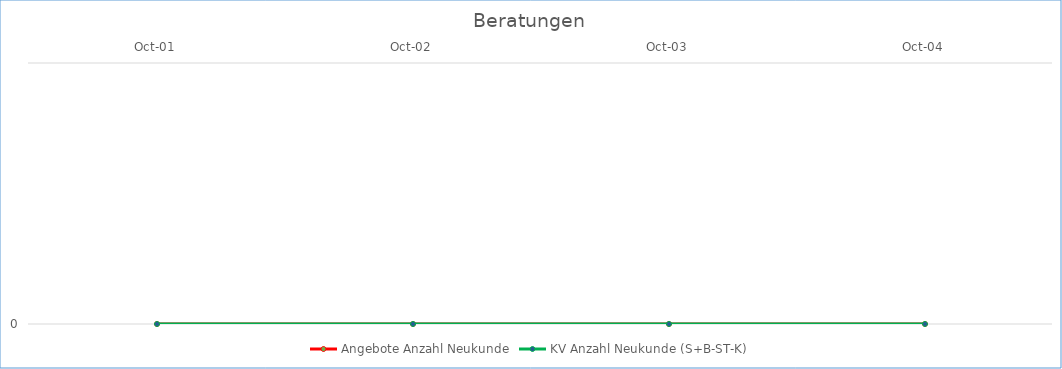
| Category | Angebote Anzahl Neukunde | KV Anzahl Neukunde (S+B-ST-K) |
|---|---|---|
| 2001-10-01 | 0 | 0 |
| 2002-10-01 | 0 | 0 |
| 2003-10-01 | 0 | 0 |
| 2004-10-01 | 0 | 0 |